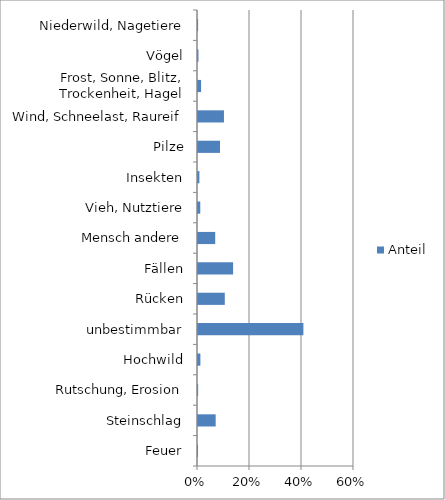
| Category | Anteil |
|---|---|
| Feuer | 0 |
| Steinschlag | 0.068 |
| Rutschung, Erosion | 0 |
| Hochwild | 0.009 |
| unbestimmbar | 0.405 |
| Rücken | 0.103 |
| Fällen | 0.135 |
| Mensch andere | 0.066 |
| Vieh, Nutztiere | 0.009 |
| Insekten | 0.005 |
| Pilze | 0.085 |
| Wind, Schneelast, Raureif | 0.1 |
| Frost, Sonne, Blitz, Trockenheit, Hagel | 0.012 |
| Vögel | 0.002 |
| Niederwild, Nagetiere | 0 |